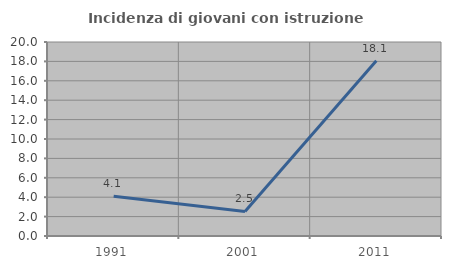
| Category | Incidenza di giovani con istruzione universitaria |
|---|---|
| 1991.0 | 4.11 |
| 2001.0 | 2.532 |
| 2011.0 | 18.072 |